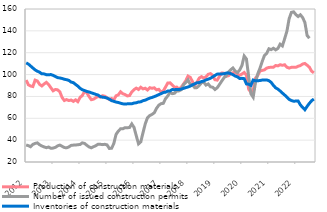
| Category | Production of construction materials |
|---|---|
| 2012-01-01 | 94.99 |
| 2012-02-01 | 90.663 |
| 2012-03-01 | 89.512 |
| 2012-04-01 | 89.028 |
| 2012-05-01 | 94.92 |
| 2012-06-01 | 94.101 |
| 2012-07-01 | 91.036 |
| 2012-08-01 | 89.582 |
| 2012-09-01 | 91.387 |
| 2012-10-01 | 92.871 |
| 2012-11-01 | 90.883 |
| 2012-12-01 | 87.975 |
| 2013-01-01 | 85.139 |
| 2013-02-01 | 86.375 |
| 2013-03-01 | 86.048 |
| 2013-04-01 | 84.217 |
| 2013-05-01 | 79.039 |
| 2013-06-01 | 76.251 |
| 2013-07-01 | 77.107 |
| 2013-08-01 | 76.217 |
| 2013-09-01 | 76.72 |
| 2013-10-01 | 75.463 |
| 2013-11-01 | 76.867 |
| 2013-12-01 | 75.2 |
| 2014-01-01 | 79.063 |
| 2014-02-01 | 80.909 |
| 2014-03-01 | 84.527 |
| 2014-04-01 | 83.303 |
| 2014-05-01 | 79.908 |
| 2014-06-01 | 77.043 |
| 2014-07-01 | 77.515 |
| 2014-08-01 | 78.798 |
| 2014-09-01 | 80.038 |
| 2014-10-01 | 79.359 |
| 2014-11-01 | 80.672 |
| 2014-12-01 | 80.148 |
| 2015-01-01 | 78.842 |
| 2015-02-01 | 77.228 |
| 2015-03-01 | 78.082 |
| 2015-04-01 | 76.722 |
| 2015-05-01 | 80.586 |
| 2015-06-01 | 81.397 |
| 2015-07-01 | 84.237 |
| 2015-08-01 | 82.508 |
| 2015-09-01 | 81.715 |
| 2015-10-01 | 80.467 |
| 2015-11-01 | 80.789 |
| 2015-12-01 | 84.103 |
| 2016-01-01 | 86.219 |
| 2016-02-01 | 87.579 |
| 2016-03-01 | 86.332 |
| 2016-04-01 | 88.392 |
| 2016-05-01 | 86.921 |
| 2016-06-01 | 87.504 |
| 2016-07-01 | 85.864 |
| 2016-08-01 | 87.988 |
| 2016-09-01 | 87.454 |
| 2016-10-01 | 87.888 |
| 2016-11-01 | 86.029 |
| 2016-12-01 | 86.506 |
| 2017-01-01 | 84.187 |
| 2017-02-01 | 84.975 |
| 2017-03-01 | 88.522 |
| 2017-04-01 | 92.264 |
| 2017-05-01 | 92.438 |
| 2017-06-01 | 90.498 |
| 2017-07-01 | 88.258 |
| 2017-08-01 | 88.557 |
| 2017-09-01 | 86.75 |
| 2017-10-01 | 88.47 |
| 2017-11-01 | 91.351 |
| 2017-12-01 | 94.271 |
| 2018-01-01 | 98.62 |
| 2018-02-01 | 97.512 |
| 2018-03-01 | 93.586 |
| 2018-04-01 | 89.958 |
| 2018-05-01 | 92.956 |
| 2018-06-01 | 96.769 |
| 2018-07-01 | 98.097 |
| 2018-08-01 | 96.779 |
| 2018-09-01 | 97.942 |
| 2018-10-31 | 100.209 |
| 2018-11-30 | 100.886 |
| 2018-12-31 | 99.234 |
| 2019-01-31 | 95.278 |
| 2019-02-28 | 94.922 |
| 2019-03-31 | 98.32 |
| 2019-04-30 | 101.421 |
| 2019-05-31 | 101.293 |
| 2019-06-30 | 98.45 |
| 2019-07-31 | 98.963 |
| 2019-08-31 | 100.824 |
| 2019-09-30 | 101.703 |
| 2019-10-31 | 102.017 |
| 2019-11-30 | 100.404 |
| 2019-12-31 | 99.402 |
| 2020-01-31 | 100.487 |
| 2020-02-29 | 101.913 |
| 2020-03-31 | 99.47 |
| 2020-04-30 | 86.524 |
| 2020-05-31 | 83.834 |
| 2020-06-30 | 85.64 |
| 2020-07-31 | 96.654 |
| 2020-08-31 | 99.145 |
| 2020-09-30 | 103.26 |
| 2020-10-31 | 103.807 |
| 2020-11-30 | 104.31 |
| 2020-12-31 | 105.901 |
| 2021-01-31 | 106.545 |
| 2021-02-28 | 106.656 |
| 2021-03-31 | 106.689 |
| 2021-04-30 | 108.306 |
| 2021-05-31 | 107.949 |
| 2021-06-30 | 108.996 |
| 2021-07-31 | 108.484 |
| 2021-08-31 | 108.968 |
| 2021-09-30 | 106.716 |
| 2021-10-31 | 105.945 |
| 2021-11-30 | 106.595 |
| 2021-12-31 | 106.631 |
| 2022-01-31 | 106.652 |
| 2022-02-28 | 107.596 |
| 2022-03-31 | 108.242 |
| 2022-04-30 | 109.649 |
| 2022-05-31 | 110.164 |
| 2022-06-30 | 108.543 |
| 2022-07-31 | 106.753 |
| 2022-08-31 | 103.087 |
| 2022-09-30 | 101.634 |